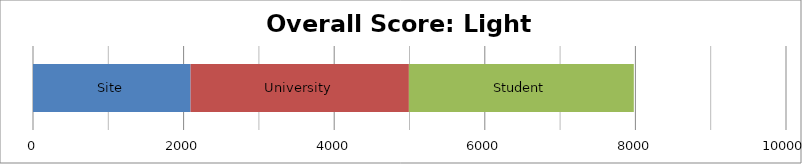
| Category | Site | University | Student |
|---|---|---|---|
| 0 | 2092.5 | 2899.375 | 2987 |